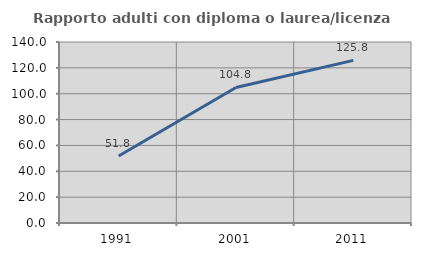
| Category | Rapporto adulti con diploma o laurea/licenza media  |
|---|---|
| 1991.0 | 51.773 |
| 2001.0 | 104.828 |
| 2011.0 | 125.806 |